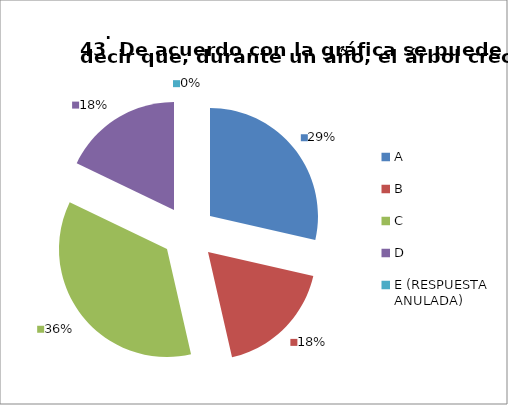
| Category | CANTIDAD DE RESPUESTAS PREGUNTA (43) | PORCENTAJE |
|---|---|---|
| A | 8 | 0.286 |
| B | 5 | 0.179 |
| C | 10 | 0.357 |
| D | 5 | 0.179 |
| E (RESPUESTA ANULADA) | 0 | 0 |